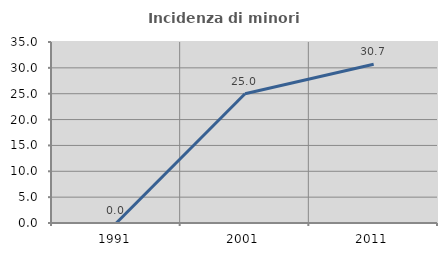
| Category | Incidenza di minori stranieri |
|---|---|
| 1991.0 | 0 |
| 2001.0 | 25 |
| 2011.0 | 30.682 |